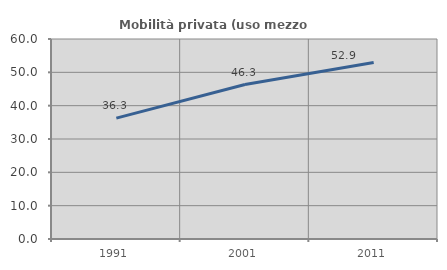
| Category | Mobilità privata (uso mezzo privato) |
|---|---|
| 1991.0 | 36.276 |
| 2001.0 | 46.344 |
| 2011.0 | 52.926 |